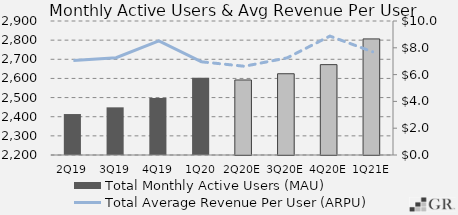
| Category | Total Monthly Active Users (MAU)  |
|---|---|
|  2Q19  | 2414 |
|  3Q19  | 2449 |
|  4Q19  | 2497.8 |
|  1Q20  | 2603 |
|  2Q20E  | 2591.919 |
|  3Q20E  | 2624.497 |
|  4Q20E  | 2672.058 |
|  1Q21E  | 2806.408 |